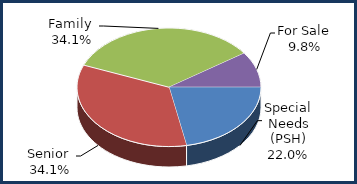
| Category | Series 0 |
|---|---|
| Special Needs (PSH) | 0.22 |
| Senior  | 0.341 |
| Family  | 0.341 |
| For Sale | 0.098 |